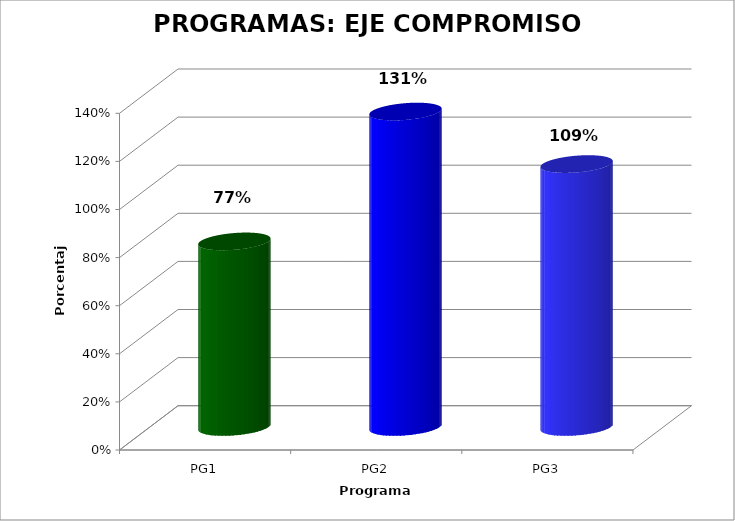
| Category | Series 0 |
|---|---|
| PG1 | 0.772 |
| PG2 | 1.312 |
| PG3 | 1.093 |